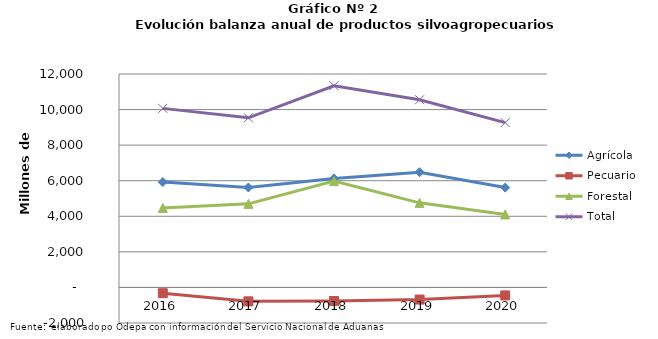
| Category | Agrícola | Pecuario | Forestal | Total |
|---|---|---|---|---|
| 2016.0 | 5924661 | -325421 | 4468104 | 10067344 |
| 2017.0 | 5619304 | -782654 | 4700192 | 9536842 |
| 2018.0 | 6126434 | -761998 | 5976134 | 11340570 |
| 2019.0 | 6480026 | -681604 | 4755333 | 10553755 |
| 2020.0 | 5612923 | -450212 | 4105630 | 9268341 |